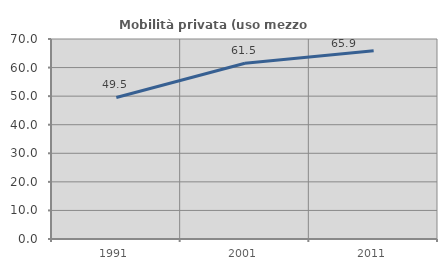
| Category | Mobilità privata (uso mezzo privato) |
|---|---|
| 1991.0 | 49.55 |
| 2001.0 | 61.538 |
| 2011.0 | 65.874 |